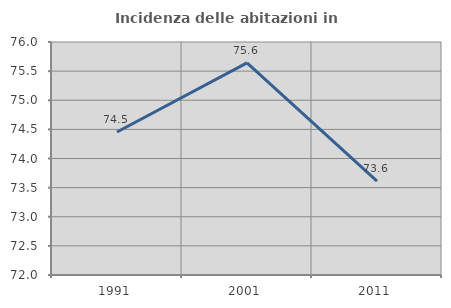
| Category | Incidenza delle abitazioni in proprietà  |
|---|---|
| 1991.0 | 74.455 |
| 2001.0 | 75.641 |
| 2011.0 | 73.611 |